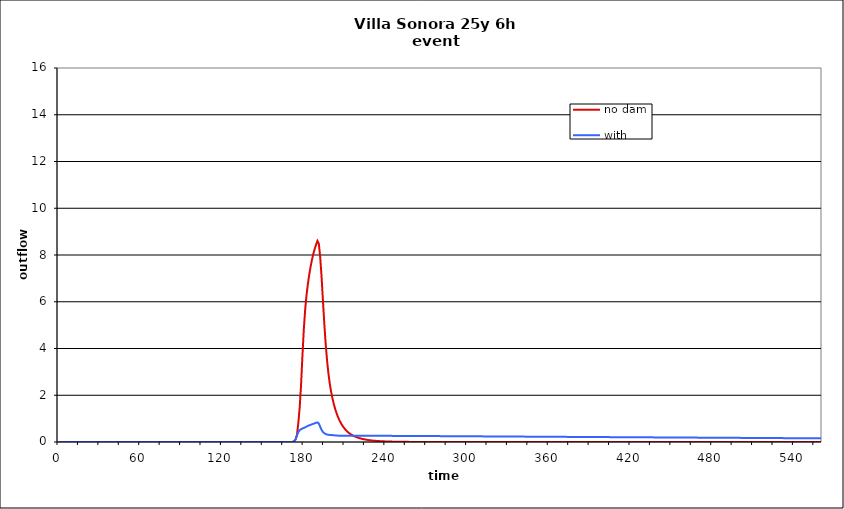
| Category | no dam | with dam |
|---|---|---|
| 0.0 | 0 | 0 |
| 1.0 | 0 | 0 |
| 2.0 | 0 | 0 |
| 3.0 | 0 | 0 |
| 4.0 | 0 | 0 |
| 5.0 | 0 | 0 |
| 6.0 | 0 | 0 |
| 7.0 | 0 | 0 |
| 8.0 | 0 | 0 |
| 9.0 | 0 | 0 |
| 10.0 | 0 | 0 |
| 11.0 | 0 | 0 |
| 12.0 | 0 | 0 |
| 13.0 | 0 | 0 |
| 14.0 | 0 | 0 |
| 15.0 | 0 | 0 |
| 16.0 | 0 | 0 |
| 17.0 | 0 | 0 |
| 18.0 | 0 | 0 |
| 19.0 | 0 | 0 |
| 20.0 | 0 | 0 |
| 21.0 | 0 | 0 |
| 22.0 | 0 | 0 |
| 23.0 | 0 | 0 |
| 24.0 | 0 | 0 |
| 25.0 | 0 | 0 |
| 26.0 | 0 | 0 |
| 27.0 | 0 | 0 |
| 28.0 | 0 | 0 |
| 29.0 | 0 | 0 |
| 30.0 | 0 | 0 |
| 31.0 | 0 | 0 |
| 32.0 | 0 | 0 |
| 33.0 | 0 | 0 |
| 34.0 | 0 | 0 |
| 35.0 | 0 | 0 |
| 36.0 | 0 | 0 |
| 37.0 | 0 | 0 |
| 38.0 | 0 | 0 |
| 39.0 | 0 | 0 |
| 40.0 | 0 | 0 |
| 41.0 | 0 | 0 |
| 42.0 | 0 | 0 |
| 43.0 | 0 | 0 |
| 44.0 | 0 | 0 |
| 45.0 | 0 | 0 |
| 46.0 | 0 | 0 |
| 47.0 | 0 | 0 |
| 48.0 | 0 | 0 |
| 49.0 | 0 | 0 |
| 50.0 | 0 | 0 |
| 51.0 | 0 | 0 |
| 52.0 | 0 | 0 |
| 53.0 | 0 | 0 |
| 54.0 | 0 | 0 |
| 55.0 | 0 | 0 |
| 56.0 | 0 | 0 |
| 57.0 | 0 | 0 |
| 58.0 | 0 | 0 |
| 59.0 | 0 | 0 |
| 60.0 | 0 | 0 |
| 61.0 | 0 | 0 |
| 62.0 | 0 | 0 |
| 63.0 | 0 | 0 |
| 64.0 | 0 | 0 |
| 65.0 | 0 | 0 |
| 66.0 | 0 | 0 |
| 67.0 | 0 | 0 |
| 68.0 | 0 | 0 |
| 69.0 | 0 | 0 |
| 70.0 | 0 | 0 |
| 71.0 | 0 | 0 |
| 72.0 | 0 | 0 |
| 73.0 | 0 | 0 |
| 74.0 | 0 | 0 |
| 75.0 | 0 | 0 |
| 76.0 | 0 | 0 |
| 77.0 | 0 | 0 |
| 78.0 | 0 | 0 |
| 79.0 | 0 | 0 |
| 80.0 | 0 | 0 |
| 81.0 | 0 | 0 |
| 82.0 | 0 | 0 |
| 83.0 | 0 | 0 |
| 84.0 | 0 | 0 |
| 85.0 | 0 | 0 |
| 86.0 | 0 | 0 |
| 87.0 | 0 | 0 |
| 88.0 | 0 | 0 |
| 89.0 | 0 | 0 |
| 90.0 | 0 | 0 |
| 91.0 | 0 | 0 |
| 92.0 | 0 | 0 |
| 93.0 | 0 | 0 |
| 94.0 | 0 | 0 |
| 95.0 | 0 | 0 |
| 96.0 | 0 | 0 |
| 97.0 | 0 | 0 |
| 98.0 | 0 | 0 |
| 99.0 | 0 | 0 |
| 100.0 | 0 | 0 |
| 101.0 | 0 | 0 |
| 102.0 | 0 | 0 |
| 103.0 | 0 | 0 |
| 104.0 | 0 | 0 |
| 105.0 | 0 | 0 |
| 106.0 | 0 | 0 |
| 107.0 | 0 | 0 |
| 108.0 | 0 | 0 |
| 109.0 | 0 | 0 |
| 110.0 | 0 | 0 |
| 111.0 | 0 | 0 |
| 112.0 | 0 | 0 |
| 113.0 | 0 | 0 |
| 114.0 | 0 | 0 |
| 115.0 | 0 | 0 |
| 116.0 | 0 | 0 |
| 117.0 | 0 | 0 |
| 118.0 | 0 | 0 |
| 119.0 | 0 | 0 |
| 120.0 | 0 | 0 |
| 121.0 | 0 | 0 |
| 122.0 | 0 | 0 |
| 123.0 | 0 | 0 |
| 124.0 | 0 | 0 |
| 125.0 | 0 | 0 |
| 126.0 | 0 | 0 |
| 127.0 | 0 | 0 |
| 128.0 | 0 | 0 |
| 129.0 | 0 | 0 |
| 130.0 | 0 | 0 |
| 131.0 | 0 | 0 |
| 132.0 | 0 | 0 |
| 133.0 | 0 | 0 |
| 134.0 | 0 | 0 |
| 135.0 | 0 | 0 |
| 136.0 | 0 | 0 |
| 137.0 | 0 | 0 |
| 138.0 | 0 | 0 |
| 139.0 | 0 | 0 |
| 140.0 | 0 | 0 |
| 141.0 | 0 | 0 |
| 142.0 | 0 | 0 |
| 143.0 | 0 | 0 |
| 144.0 | 0 | 0 |
| 145.0 | 0 | 0 |
| 146.0 | 0 | 0 |
| 147.0 | 0 | 0 |
| 148.0 | 0 | 0 |
| 149.0 | 0 | 0 |
| 150.0 | 0 | 0 |
| 151.0 | 0 | 0 |
| 152.0 | 0 | 0 |
| 153.0 | 0 | 0 |
| 154.0 | 0 | 0 |
| 155.0 | 0 | 0 |
| 156.0 | 0 | 0 |
| 157.0 | 0 | 0 |
| 158.0 | 0 | 0 |
| 159.0 | 0 | 0 |
| 160.0 | 0 | 0 |
| 161.0 | 0 | 0 |
| 162.0 | 0 | 0 |
| 163.0 | 0 | 0 |
| 164.0 | 0 | 0 |
| 165.0 | 0 | 0 |
| 166.0 | 0 | 0 |
| 167.0 | 0 | 0 |
| 168.0 | 0 | 0 |
| 169.0 | 0 | 0 |
| 170.0 | 0 | 0 |
| 171.0 | 0 | 0 |
| 172.0 | 0.007 | 0.007 |
| 173.0 | 0.037 | 0.037 |
| 174.0 | 0.119 | 0.119 |
| 175.0 | 0.315 | 0.276 |
| 176.0 | 0.827 | 0.432 |
| 177.0 | 1.496 | 0.51 |
| 178.0 | 2.476 | 0.548 |
| 179.0 | 3.698 | 0.575 |
| 180.0 | 4.821 | 0.601 |
| 181.0 | 5.666 | 0.63 |
| 182.0 | 6.289 | 0.662 |
| 183.0 | 6.766 | 0.689 |
| 184.0 | 7.16 | 0.713 |
| 185.0 | 7.506 | 0.736 |
| 186.0 | 7.8 | 0.758 |
| 187.0 | 8.05 | 0.779 |
| 188.0 | 8.261 | 0.8 |
| 189.0 | 8.443 | 0.821 |
| 190.0 | 8.604 | 0.84 |
| 191.0 | 8.493 | 0.791 |
| 192.0 | 7.931 | 0.654 |
| 193.0 | 7.098 | 0.523 |
| 194.0 | 6.09 | 0.434 |
| 195.0 | 5.103 | 0.377 |
| 196.0 | 4.241 | 0.342 |
| 197.0 | 3.531 | 0.321 |
| 198.0 | 2.966 | 0.308 |
| 199.0 | 2.519 | 0.301 |
| 200.0 | 2.165 | 0.297 |
| 201.0 | 1.875 | 0.293 |
| 202.0 | 1.629 | 0.288 |
| 203.0 | 1.419 | 0.281 |
| 204.0 | 1.238 | 0.276 |
| 205.0 | 1.082 | 0.273 |
| 206.0 | 0.949 | 0.271 |
| 207.0 | 0.833 | 0.269 |
| 208.0 | 0.732 | 0.268 |
| 209.0 | 0.644 | 0.268 |
| 210.0 | 0.567 | 0.267 |
| 211.0 | 0.5 | 0.267 |
| 212.0 | 0.443 | 0.267 |
| 213.0 | 0.392 | 0.266 |
| 214.0 | 0.349 | 0.266 |
| 215.0 | 0.311 | 0.267 |
| 216.0 | 0.278 | 0.267 |
| 217.0 | 0.249 | 0.267 |
| 218.0 | 0.223 | 0.267 |
| 219.0 | 0.201 | 0.267 |
| 220.0 | 0.181 | 0.267 |
| 221.0 | 0.163 | 0.267 |
| 222.0 | 0.146 | 0.267 |
| 223.0 | 0.132 | 0.267 |
| 224.0 | 0.119 | 0.267 |
| 225.0 | 0.107 | 0.267 |
| 226.0 | 0.097 | 0.266 |
| 227.0 | 0.087 | 0.266 |
| 228.0 | 0.079 | 0.266 |
| 229.0 | 0.071 | 0.266 |
| 230.0 | 0.065 | 0.266 |
| 231.0 | 0.059 | 0.266 |
| 232.0 | 0.053 | 0.265 |
| 233.0 | 0.048 | 0.265 |
| 234.0 | 0.044 | 0.265 |
| 235.0 | 0.04 | 0.265 |
| 236.0 | 0.036 | 0.264 |
| 237.0 | 0.033 | 0.264 |
| 238.0 | 0.03 | 0.264 |
| 239.0 | 0.027 | 0.264 |
| 240.0 | 0.025 | 0.263 |
| 241.0 | 0.022 | 0.263 |
| 242.0 | 0.02 | 0.263 |
| 243.0 | 0.019 | 0.263 |
| 244.0 | 0.017 | 0.262 |
| 245.0 | 0.016 | 0.262 |
| 246.0 | 0.014 | 0.262 |
| 247.0 | 0.013 | 0.261 |
| 248.0 | 0.012 | 0.261 |
| 249.0 | 0.011 | 0.261 |
| 250.0 | 0.01 | 0.261 |
| 251.0 | 0.009 | 0.26 |
| 252.0 | 0.008 | 0.26 |
| 253.0 | 0.008 | 0.26 |
| 254.0 | 0.007 | 0.259 |
| 255.0 | 0.006 | 0.259 |
| 256.0 | 0.006 | 0.259 |
| 257.0 | 0.005 | 0.258 |
| 258.0 | 0.005 | 0.258 |
| 259.0 | 0.004 | 0.258 |
| 260.0 | 0.004 | 0.258 |
| 261.0 | 0.003 | 0.257 |
| 262.0 | 0.003 | 0.257 |
| 263.0 | 0.003 | 0.257 |
| 264.0 | 0.002 | 0.256 |
| 265.0 | 0.002 | 0.256 |
| 266.0 | 0.002 | 0.256 |
| 267.0 | 0.002 | 0.255 |
| 268.0 | 0.001 | 0.255 |
| 269.0 | 0.001 | 0.255 |
| 270.0 | 0.001 | 0.254 |
| 271.0 | 0.001 | 0.254 |
| 272.0 | 0.001 | 0.254 |
| 273.0 | 0.001 | 0.253 |
| 274.0 | 0.001 | 0.253 |
| 275.0 | 0.001 | 0.253 |
| 276.0 | 0.001 | 0.253 |
| 277.0 | 0 | 0.252 |
| 278.0 | 0 | 0.252 |
| 279.0 | 0 | 0.252 |
| 280.0 | 0 | 0.251 |
| 281.0 | 0 | 0.251 |
| 282.0 | 0 | 0.251 |
| 283.0 | 0 | 0.25 |
| 284.0 | 0 | 0.25 |
| 285.0 | 0 | 0.25 |
| 286.0 | 0 | 0.249 |
| 287.0 | 0 | 0.249 |
| 288.0 | 0 | 0.249 |
| 289.0 | 0 | 0.248 |
| 290.0 | 0 | 0.248 |
| 291.0 | 0 | 0.248 |
| 292.0 | 0 | 0.247 |
| 293.0 | 0 | 0.247 |
| 294.0 | 0 | 0.247 |
| 295.0 | 0 | 0.246 |
| 296.0 | 0 | 0.246 |
| 297.0 | 0 | 0.246 |
| 298.0 | 0 | 0.245 |
| 299.0 | 0 | 0.245 |
| 300.0 | 0 | 0.245 |
| 301.0 | 0 | 0.244 |
| 302.0 | 0 | 0.244 |
| 303.0 | 0 | 0.243 |
| 304.0 | 0 | 0.243 |
| 305.0 | 0 | 0.243 |
| 306.0 | 0 | 0.242 |
| 307.0 | 0 | 0.242 |
| 308.0 | 0 | 0.242 |
| 309.0 | 0 | 0.241 |
| 310.0 | 0 | 0.241 |
| 311.0 | 0 | 0.241 |
| 312.0 | 0 | 0.24 |
| 313.0 | 0 | 0.24 |
| 314.0 | 0 | 0.24 |
| 315.0 | 0 | 0.239 |
| 316.0 | 0 | 0.239 |
| 317.0 | 0 | 0.239 |
| 318.0 | 0 | 0.238 |
| 319.0 | 0 | 0.238 |
| 320.0 | 0 | 0.238 |
| 321.0 | 0 | 0.237 |
| 322.0 | 0 | 0.237 |
| 323.0 | 0 | 0.236 |
| 324.0 | 0 | 0.236 |
| 325.0 | 0 | 0.236 |
| 326.0 | 0 | 0.235 |
| 327.0 | 0 | 0.235 |
| 328.0 | 0 | 0.235 |
| 329.0 | 0 | 0.234 |
| 330.0 | 0 | 0.234 |
| 331.0 | 0 | 0.234 |
| 332.0 | 0 | 0.233 |
| 333.0 | 0 | 0.233 |
| 334.0 | 0 | 0.233 |
| 335.0 | 0 | 0.232 |
| 336.0 | 0 | 0.232 |
| 337.0 | 0 | 0.232 |
| 338.0 | 0 | 0.231 |
| 339.0 | 0 | 0.231 |
| 340.0 | 0 | 0.231 |
| 341.0 | 0 | 0.23 |
| 342.0 | 0 | 0.23 |
| 343.0 | 0 | 0.23 |
| 344.0 | 0 | 0.229 |
| 345.0 | 0 | 0.229 |
| 346.0 | 0 | 0.229 |
| 347.0 | 0 | 0.228 |
| 348.0 | 0 | 0.228 |
| 349.0 | 0 | 0.227 |
| 350.0 | 0 | 0.227 |
| 351.0 | 0 | 0.227 |
| 352.0 | 0 | 0.226 |
| 353.0 | 0 | 0.226 |
| 354.0 | 0 | 0.226 |
| 355.0 | 0 | 0.225 |
| 356.0 | 0 | 0.225 |
| 357.0 | 0 | 0.225 |
| 358.0 | 0 | 0.224 |
| 359.0 | 0 | 0.224 |
| 360.0 | 0 | 0.224 |
| 361.0 | 0 | 0.223 |
| 362.0 | 0 | 0.223 |
| 363.0 | 0 | 0.223 |
| 364.0 | 0 | 0.222 |
| 365.0 | 0 | 0.222 |
| 366.0 | 0 | 0.222 |
| 367.0 | 0 | 0.221 |
| 368.0 | 0 | 0.221 |
| 369.0 | 0 | 0.221 |
| 370.0 | 0 | 0.22 |
| 371.0 | 0 | 0.22 |
| 372.0 | 0 | 0.22 |
| 373.0 | 0 | 0.219 |
| 374.0 | 0 | 0.219 |
| 375.0 | 0 | 0.218 |
| 376.0 | 0 | 0.218 |
| 377.0 | 0 | 0.218 |
| 378.0 | 0 | 0.217 |
| 379.0 | 0 | 0.217 |
| 380.0 | 0 | 0.217 |
| 381.0 | 0 | 0.216 |
| 382.0 | 0 | 0.216 |
| 383.0 | 0 | 0.216 |
| 384.0 | 0 | 0.215 |
| 385.0 | 0 | 0.215 |
| 386.0 | 0 | 0.215 |
| 387.0 | 0 | 0.214 |
| 388.0 | 0 | 0.214 |
| 389.0 | 0 | 0.214 |
| 390.0 | 0 | 0.213 |
| 391.0 | 0 | 0.213 |
| 392.0 | 0 | 0.213 |
| 393.0 | 0 | 0.212 |
| 394.0 | 0 | 0.212 |
| 395.0 | 0 | 0.212 |
| 396.0 | 0 | 0.211 |
| 397.0 | 0 | 0.211 |
| 398.0 | 0 | 0.211 |
| 399.0 | 0 | 0.21 |
| 400.0 | 0 | 0.21 |
| 401.0 | 0 | 0.21 |
| 402.0 | 0 | 0.209 |
| 403.0 | 0 | 0.209 |
| 404.0 | 0 | 0.209 |
| 405.0 | 0 | 0.208 |
| 406.0 | 0 | 0.208 |
| 407.0 | 0 | 0.208 |
| 408.0 | 0 | 0.207 |
| 409.0 | 0 | 0.207 |
| 410.0 | 0 | 0.207 |
| 411.0 | 0 | 0.206 |
| 412.0 | 0 | 0.206 |
| 413.0 | 0 | 0.206 |
| 414.0 | 0 | 0.205 |
| 415.0 | 0 | 0.205 |
| 416.0 | 0 | 0.205 |
| 417.0 | 0 | 0.204 |
| 418.0 | 0 | 0.204 |
| 419.0 | 0 | 0.204 |
| 420.0 | 0 | 0.203 |
| 421.0 | 0 | 0.203 |
| 422.0 | 0 | 0.203 |
| 423.0 | 0 | 0.202 |
| 424.0 | 0 | 0.202 |
| 425.0 | 0 | 0.202 |
| 426.0 | 0 | 0.201 |
| 427.0 | 0 | 0.201 |
| 428.0 | 0 | 0.201 |
| 429.0 | 0 | 0.2 |
| 430.0 | 0 | 0.2 |
| 431.0 | 0 | 0.2 |
| 432.0 | 0 | 0.199 |
| 433.0 | 0 | 0.199 |
| 434.0 | 0 | 0.199 |
| 435.0 | 0 | 0.198 |
| 436.0 | 0 | 0.198 |
| 437.0 | 0 | 0.198 |
| 438.0 | 0 | 0.197 |
| 439.0 | 0 | 0.197 |
| 440.0 | 0 | 0.197 |
| 441.0 | 0 | 0.196 |
| 442.0 | 0 | 0.196 |
| 443.0 | 0 | 0.196 |
| 444.0 | 0 | 0.195 |
| 445.0 | 0 | 0.195 |
| 446.0 | 0 | 0.195 |
| 447.0 | 0 | 0.194 |
| 448.0 | 0 | 0.194 |
| 449.0 | 0 | 0.194 |
| 450.0 | 0 | 0.193 |
| 451.0 | 0 | 0.193 |
| 452.0 | 0 | 0.193 |
| 453.0 | 0 | 0.192 |
| 454.0 | 0 | 0.192 |
| 455.0 | 0 | 0.192 |
| 456.0 | 0 | 0.191 |
| 457.0 | 0 | 0.191 |
| 458.0 | 0 | 0.191 |
| 459.0 | 0 | 0.19 |
| 460.0 | 0 | 0.19 |
| 461.0 | 0 | 0.19 |
| 462.0 | 0 | 0.189 |
| 463.0 | 0 | 0.189 |
| 464.0 | 0 | 0.189 |
| 465.0 | 0 | 0.188 |
| 466.0 | 0 | 0.188 |
| 467.0 | 0 | 0.188 |
| 468.0 | 0 | 0.187 |
| 469.0 | 0 | 0.187 |
| 470.0 | 0 | 0.187 |
| 471.0 | 0 | 0.186 |
| 472.0 | 0 | 0.186 |
| 473.0 | 0 | 0.186 |
| 474.0 | 0 | 0.186 |
| 475.0 | 0 | 0.185 |
| 476.0 | 0 | 0.185 |
| 477.0 | 0 | 0.185 |
| 478.0 | 0 | 0.184 |
| 479.0 | 0 | 0.184 |
| 480.0 | 0 | 0.184 |
| 481.0 | 0 | 0.183 |
| 482.0 | 0 | 0.183 |
| 483.0 | 0 | 0.183 |
| 484.0 | 0 | 0.182 |
| 485.0 | 0 | 0.182 |
| 486.0 | 0 | 0.182 |
| 487.0 | 0 | 0.181 |
| 488.0 | 0 | 0.181 |
| 489.0 | 0 | 0.18 |
| 490.0 | 0 | 0.18 |
| 491.0 | 0 | 0.18 |
| 492.0 | 0 | 0.179 |
| 493.0 | 0 | 0.179 |
| 494.0 | 0 | 0.179 |
| 495.0 | 0 | 0.178 |
| 496.0 | 0 | 0.178 |
| 497.0 | 0 | 0.178 |
| 498.0 | 0 | 0.177 |
| 499.0 | 0 | 0.177 |
| 500.0 | 0 | 0.177 |
| 501.0 | 0 | 0.176 |
| 502.0 | 0 | 0.176 |
| 503.0 | 0 | 0.176 |
| 504.0 | 0 | 0.175 |
| 505.0 | 0 | 0.175 |
| 506.0 | 0 | 0.175 |
| 507.0 | 0 | 0.174 |
| 508.0 | 0 | 0.174 |
| 509.0 | 0 | 0.174 |
| 510.0 | 0 | 0.173 |
| 511.0 | 0 | 0.173 |
| 512.0 | 0 | 0.173 |
| 513.0 | 0 | 0.172 |
| 514.0 | 0 | 0.172 |
| 515.0 | 0 | 0.171 |
| 516.0 | 0 | 0.171 |
| 517.0 | 0 | 0.171 |
| 518.0 | 0 | 0.17 |
| 519.0 | 0 | 0.17 |
| 520.0 | 0 | 0.17 |
| 521.0 | 0 | 0.169 |
| 522.0 | 0 | 0.169 |
| 523.0 | 0 | 0.169 |
| 524.0 | 0 | 0.168 |
| 525.0 | 0 | 0.168 |
| 526.0 | 0 | 0.168 |
| 527.0 | 0 | 0.167 |
| 528.0 | 0 | 0.167 |
| 529.0 | 0 | 0.167 |
| 530.0 | 0 | 0.166 |
| 531.0 | 0 | 0.166 |
| 532.0 | 0 | 0.166 |
| 533.0 | 0 | 0.165 |
| 534.0 | 0 | 0.165 |
| 535.0 | 0 | 0.165 |
| 536.0 | 0 | 0.164 |
| 537.0 | 0 | 0.164 |
| 538.0 | 0 | 0.164 |
| 539.0 | 0 | 0.163 |
| 540.0 | 0 | 0.163 |
| 541.0 | 0 | 0.163 |
| 542.0 | 0 | 0.162 |
| 543.0 | 0 | 0.162 |
| 544.0 | 0 | 0.162 |
| 545.0 | 0 | 0.161 |
| 546.0 | 0 | 0.161 |
| 547.0 | 0 | 0.161 |
| 548.0 | 0 | 0.16 |
| 549.0 | 0 | 0.16 |
| 550.0 | 0 | 0.16 |
| 551.0 | 0 | 0.159 |
| 552.0 | 0 | 0.159 |
| 553.0 | 0 | 0.159 |
| 554.0 | 0 | 0.158 |
| 555.0 | 0 | 0.158 |
| 556.0 | 0 | 0.158 |
| 557.0 | 0 | 0.157 |
| 558.0 | 0 | 0.157 |
| 559.0 | 0 | 0.157 |
| 560.0 | 0 | 0.156 |